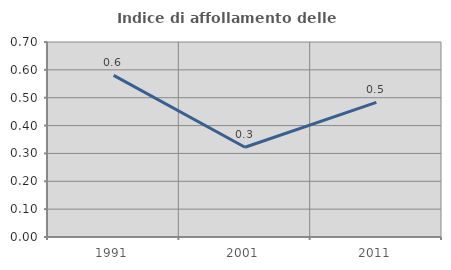
| Category | Indice di affollamento delle abitazioni  |
|---|---|
| 1991.0 | 0.58 |
| 2001.0 | 0.322 |
| 2011.0 | 0.483 |